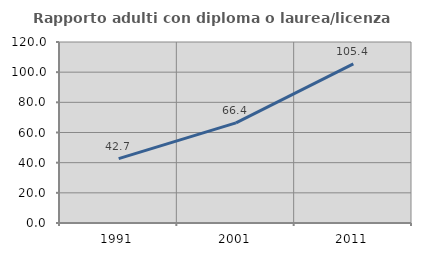
| Category | Rapporto adulti con diploma o laurea/licenza media  |
|---|---|
| 1991.0 | 42.689 |
| 2001.0 | 66.392 |
| 2011.0 | 105.45 |